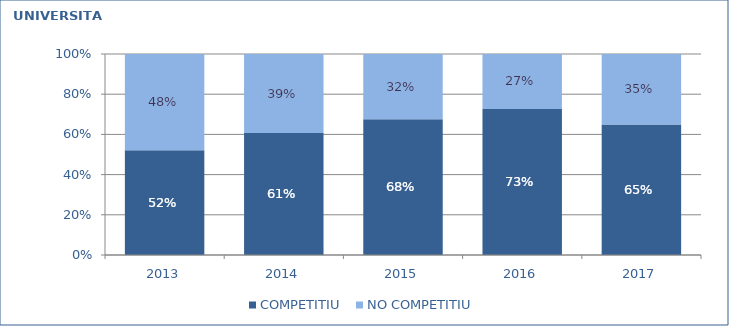
| Category | COMPETITIU  | NO COMPETITIU |
|---|---|---|
| 2013.0 | 0.522 | 0.478 |
| 2014.0 | 0.607 | 0.393 |
| 2015.0 | 0.676 | 0.324 |
| 2016.0 | 0.727 | 0.273 |
| 2017.0 | 0.65 | 0.35 |